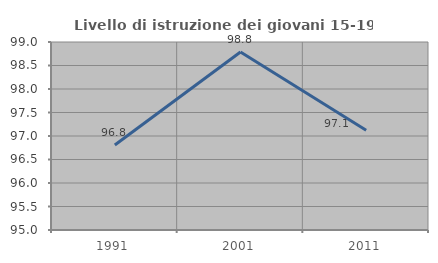
| Category | Livello di istruzione dei giovani 15-19 anni |
|---|---|
| 1991.0 | 96.809 |
| 2001.0 | 98.788 |
| 2011.0 | 97.122 |